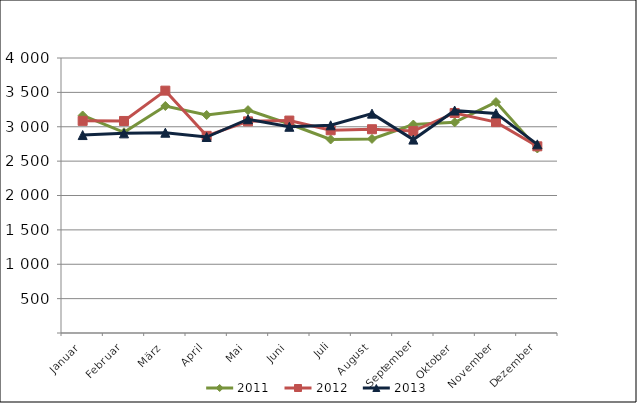
| Category | 2011 | 2012 | 2013 |
|---|---|---|---|
| Januar | 3163.896 | 3085.49 | 2879.307 |
| Februar | 2919.581 | 3084.234 | 2903.853 |
| März | 3301.841 | 3525.086 | 2913.349 |
| April | 3170.607 | 2867.937 | 2850.861 |
| Mai | 3241.763 | 3078.592 | 3109.389 |
| Juni | 3040.222 | 3089.923 | 2999.587 |
| Juli | 2814.862 | 2948.674 | 3021.085 |
| August | 2823.03 | 2964.066 | 3190.723 |
| September | 3031.864 | 2936.627 | 2813.093 |
| Oktober | 3063.918 | 3200.424 | 3236.046 |
| November | 3358.879 | 3067.028 | 3194.378 |
| Dezember | 2683.93 | 2715.267 | 2743.882 |